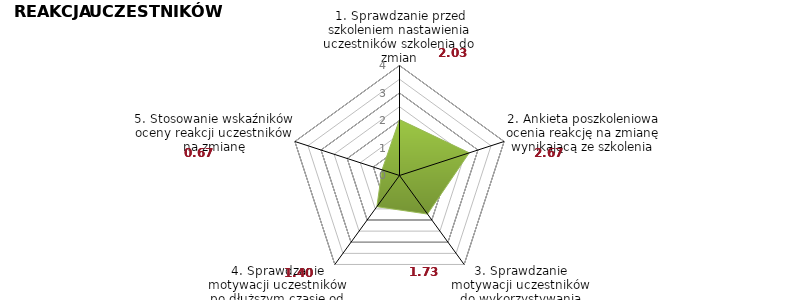
| Category | Series 0 | BENCHMARK |
|---|---|---|
| 1. Sprawdzanie przed szkoleniem nastawienia uczestników szkolenia do zmian |  | 2.033 |
| 2. Ankieta poszkoleniowa ocenia reakcję na zmianę wynikającą ze szkolenia |  | 2.667 |
| 3. Sprawdzanie motywacji uczestników do wykorzystywania nowych kompetencji |  | 1.733 |
| 4. Sprawdzanie motywacji uczestników po dłuższym czasie od szkolenia |  | 1.4 |
| 5. Stosowanie wskaźników oceny reakcji uczestników na zmianę |  | 0.667 |